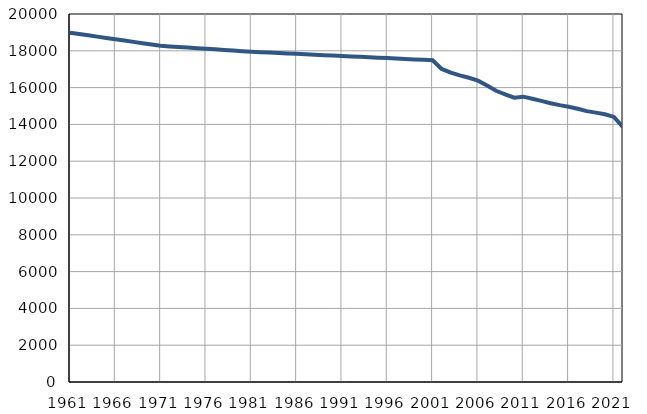
| Category | Број
становника |
|---|---|
| 1961.0 | 18985 |
| 1962.0 | 18914 |
| 1963.0 | 18842 |
| 1964.0 | 18771 |
| 1965.0 | 18699 |
| 1966.0 | 18628 |
| 1967.0 | 18556 |
| 1968.0 | 18485 |
| 1969.0 | 18413 |
| 1970.0 | 18342 |
| 1971.0 | 18270 |
| 1972.0 | 18238 |
| 1973.0 | 18207 |
| 1974.0 | 18174 |
| 1975.0 | 18142 |
| 1976.0 | 18110 |
| 1977.0 | 18078 |
| 1978.0 | 18046 |
| 1979.0 | 18013 |
| 1980.0 | 17982 |
| 1981.0 | 17950 |
| 1982.0 | 17927 |
| 1983.0 | 17903 |
| 1984.0 | 17880 |
| 1985.0 | 17856 |
| 1986.0 | 17833 |
| 1987.0 | 17810 |
| 1988.0 | 17786 |
| 1989.0 | 17762 |
| 1990.0 | 17739 |
| 1991.0 | 17716 |
| 1992.0 | 17694 |
| 1993.0 | 17670 |
| 1994.0 | 17648 |
| 1995.0 | 17625 |
| 1996.0 | 17603 |
| 1997.0 | 17579 |
| 1998.0 | 17556 |
| 1999.0 | 17533 |
| 2000.0 | 17511 |
| 2001.0 | 17488 |
| 2002.0 | 17012 |
| 2003.0 | 16815 |
| 2004.0 | 16662 |
| 2005.0 | 16533 |
| 2006.0 | 16380 |
| 2007.0 | 16119 |
| 2008.0 | 15828 |
| 2009.0 | 15637 |
| 2010.0 | 15454 |
| 2011.0 | 15507 |
| 2012.0 | 15398 |
| 2013.0 | 15281 |
| 2014.0 | 15150 |
| 2015.0 | 15046 |
| 2016.0 | 14962 |
| 2017.0 | 14851 |
| 2018.0 | 14721 |
| 2019.0 | 14639 |
| 2020.0 | 14553 |
| 2021.0 | 14407 |
| 2022.0 | 13846 |